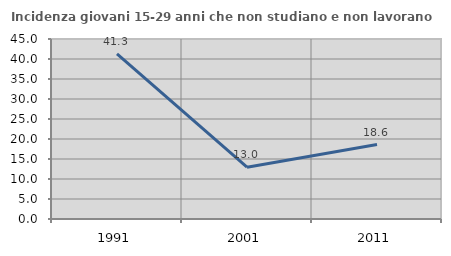
| Category | Incidenza giovani 15-29 anni che non studiano e non lavorano  |
|---|---|
| 1991.0 | 41.304 |
| 2001.0 | 12.963 |
| 2011.0 | 18.605 |